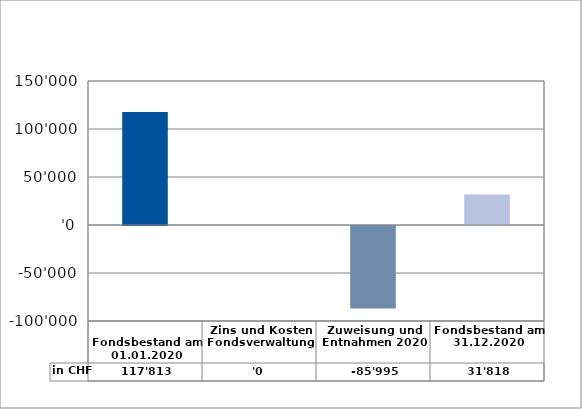
| Category | in CHF |
|---|---|
| 
Fondsbestand am 01.01.2020

 | 117813 |
| Zins und Kosten Fondsverwaltung | 0 |
| Zuweisung und Entnahmen 2020 | -85994.85 |
| Fondsbestand am 31.12.2020 | 31818.15 |